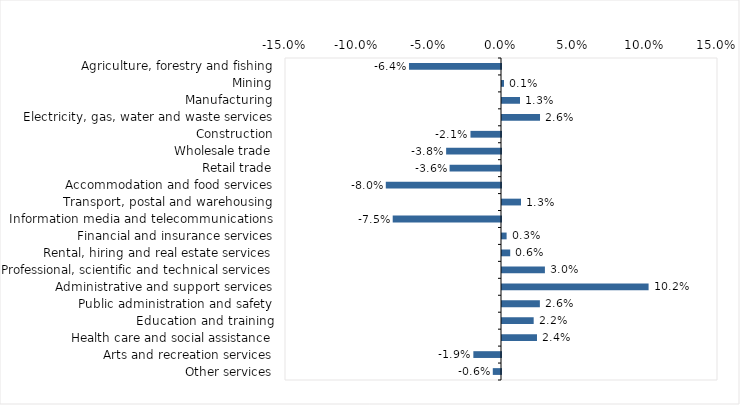
| Category | This week |
|---|---|
| Agriculture, forestry and fishing | -0.064 |
| Mining | 0.001 |
| Manufacturing | 0.012 |
| Electricity, gas, water and waste services | 0.026 |
| Construction | -0.021 |
| Wholesale trade | -0.038 |
| Retail trade | -0.036 |
| Accommodation and food services | -0.08 |
| Transport, postal and warehousing | 0.013 |
| Information media and telecommunications | -0.075 |
| Financial and insurance services | 0.003 |
| Rental, hiring and real estate services | 0.006 |
| Professional, scientific and technical services | 0.03 |
| Administrative and support services | 0.102 |
| Public administration and safety | 0.026 |
| Education and training | 0.022 |
| Health care and social assistance | 0.024 |
| Arts and recreation services | -0.019 |
| Other services | -0.006 |